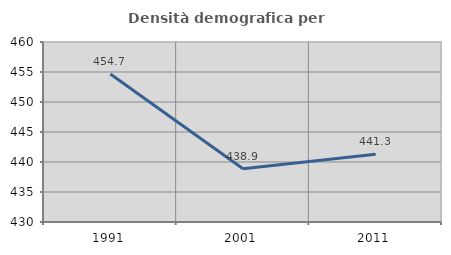
| Category | Densità demografica |
|---|---|
| 1991.0 | 454.66 |
| 2001.0 | 438.88 |
| 2011.0 | 441.293 |